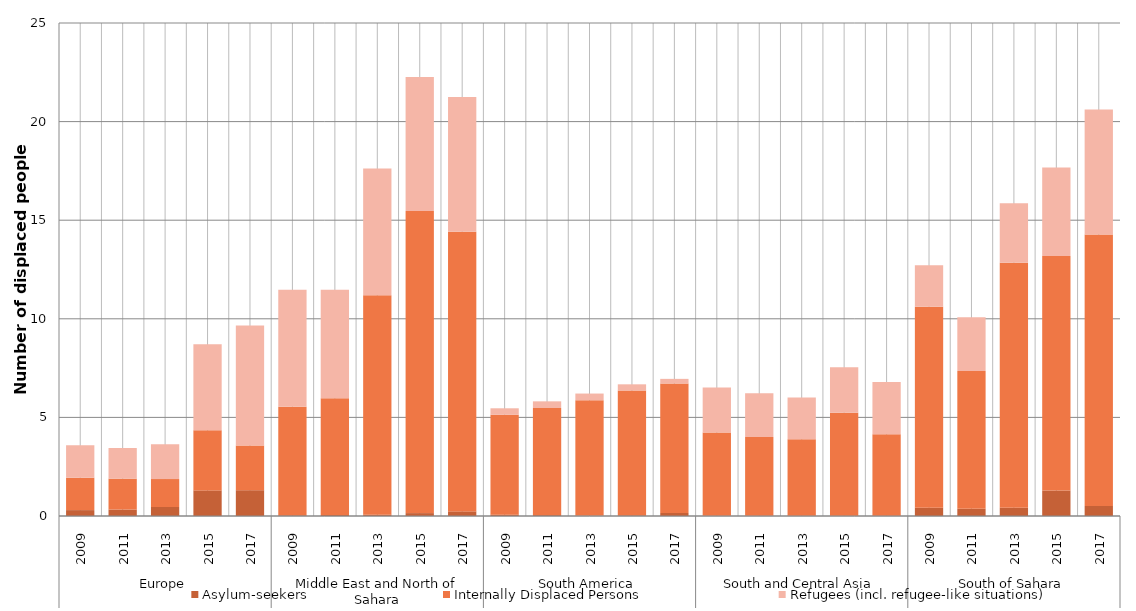
| Category | Asylum-seekers | Internally Displaced Persons | Refugees (incl. refugee-like situations) |
|---|---|---|---|
| 0 | 0.299 | 1.643 | 1.641 |
| 1 | 0.328 | 1.567 | 1.552 |
| 2 | 0.456 | 1.418 | 1.767 |
| 3 | 1.298 | 3.047 | 4.364 |
| 4 | 1.308 | 2.264 | 6.093 |
| 5 | 0.036 | 5.507 | 5.931 |
| 6 | 0.051 | 5.92 | 5.502 |
| 7 | 0.065 | 11.126 | 6.428 |
| 8 | 0.147 | 15.314 | 6.799 |
| 9 | 0.234 | 14.182 | 6.835 |
| 10 | 0.067 | 5.066 | 0.329 |
| 11 | 0.046 | 5.431 | 0.337 |
| 12 | 0.019 | 5.85 | 0.34 |
| 13 | 0.035 | 6.33 | 0.312 |
| 14 | 0.152 | 6.568 | 0.234 |
| 15 | 0.011 | 4.225 | 2.278 |
| 16 | 0.009 | 4.003 | 2.209 |
| 17 | 0.014 | 3.877 | 2.119 |
| 18 | 0.015 | 5.22 | 2.311 |
| 19 | 0.017 | 4.132 | 2.644 |
| 20 | 0.42 | 10.193 | 2.102 |
| 21 | 0.367 | 6.992 | 2.72 |
| 22 | 0.419 | 12.42 | 3.026 |
| 23 | 1.294 | 11.892 | 4.491 |
| 24 | 0.51 | 13.761 | 6.346 |